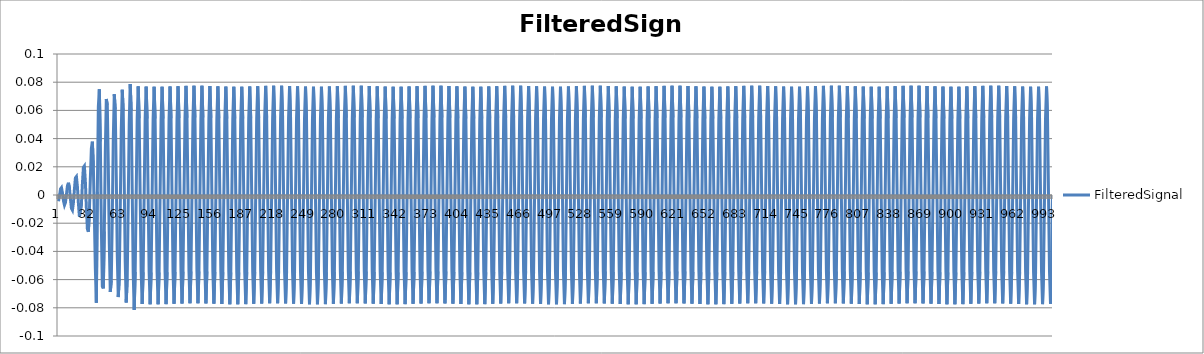
| Category | FilteredSignal |
|---|---|
| 0 | -0.004 |
| 1 | -0.001 |
| 2 | 0.004 |
| 3 | 0.005 |
| 4 | 0.001 |
| 5 | -0.004 |
| 6 | -0.007 |
| 7 | -0.005 |
| 8 | 0.001 |
| 9 | 0.007 |
| 10 | 0.009 |
| 11 | 0.005 |
| 12 | -0.003 |
| 13 | -0.01 |
| 14 | -0.011 |
| 15 | -0.005 |
| 16 | 0.004 |
| 17 | 0.012 |
| 18 | 0.013 |
| 19 | 0.006 |
| 20 | -0.006 |
| 21 | -0.015 |
| 22 | -0.016 |
| 23 | -0.007 |
| 24 | 0.008 |
| 25 | 0.02 |
| 26 | 0.021 |
| 27 | 0.009 |
| 28 | -0.009 |
| 29 | -0.024 |
| 30 | -0.026 |
| 31 | -0.012 |
| 32 | 0.012 |
| 33 | 0.033 |
| 34 | 0.038 |
| 35 | 0.02 |
| 36 | -0.014 |
| 37 | -0.052 |
| 38 | -0.076 |
| 39 | 0.002 |
| 40 | 0.063 |
| 41 | 0.075 |
| 42 | 0.038 |
| 43 | -0.021 |
| 44 | -0.065 |
| 45 | -0.066 |
| 46 | -0.026 |
| 47 | 0.031 |
| 48 | 0.068 |
| 49 | 0.064 |
| 50 | 0.021 |
| 51 | -0.035 |
| 52 | -0.069 |
| 53 | -0.061 |
| 54 | -0.016 |
| 55 | 0.04 |
| 56 | 0.071 |
| 57 | 0.061 |
| 58 | 0.013 |
| 59 | -0.042 |
| 60 | -0.072 |
| 61 | -0.059 |
| 62 | -0.01 |
| 63 | 0.045 |
| 64 | 0.075 |
| 65 | 0.06 |
| 66 | 0.009 |
| 67 | -0.048 |
| 68 | -0.076 |
| 69 | -0.06 |
| 70 | -0.007 |
| 71 | 0.051 |
| 72 | 0.079 |
| 73 | 0.06 |
| 74 | 0.004 |
| 75 | -0.055 |
| 76 | -0.081 |
| 77 | -0.055 |
| 78 | 0 |
| 79 | 0.055 |
| 80 | 0.077 |
| 81 | 0.054 |
| 82 | 0 |
| 83 | -0.055 |
| 84 | -0.077 |
| 85 | -0.055 |
| 86 | 0 |
| 87 | 0.054 |
| 88 | 0.077 |
| 89 | 0.054 |
| 90 | 0 |
| 91 | -0.055 |
| 92 | -0.077 |
| 93 | -0.055 |
| 94 | 0 |
| 95 | 0.054 |
| 96 | 0.077 |
| 97 | 0.054 |
| 98 | 0 |
| 99 | -0.055 |
| 100 | -0.077 |
| 101 | -0.055 |
| 102 | 0 |
| 103 | 0.054 |
| 104 | 0.077 |
| 105 | 0.054 |
| 106 | 0 |
| 107 | -0.055 |
| 108 | -0.077 |
| 109 | -0.055 |
| 110 | 0 |
| 111 | 0.054 |
| 112 | 0.077 |
| 113 | 0.054 |
| 114 | 0 |
| 115 | -0.055 |
| 116 | -0.077 |
| 117 | -0.055 |
| 118 | 0 |
| 119 | 0.055 |
| 120 | 0.077 |
| 121 | 0.055 |
| 122 | 0 |
| 123 | -0.054 |
| 124 | -0.077 |
| 125 | -0.054 |
| 126 | 0 |
| 127 | 0.055 |
| 128 | 0.077 |
| 129 | 0.055 |
| 130 | 0 |
| 131 | -0.054 |
| 132 | -0.077 |
| 133 | -0.054 |
| 134 | 0 |
| 135 | 0.055 |
| 136 | 0.077 |
| 137 | 0.055 |
| 138 | 0 |
| 139 | -0.054 |
| 140 | -0.077 |
| 141 | -0.054 |
| 142 | 0 |
| 143 | 0.055 |
| 144 | 0.077 |
| 145 | 0.055 |
| 146 | 0 |
| 147 | -0.054 |
| 148 | -0.077 |
| 149 | -0.054 |
| 150 | 0 |
| 151 | 0.055 |
| 152 | 0.077 |
| 153 | 0.055 |
| 154 | 0 |
| 155 | -0.054 |
| 156 | -0.077 |
| 157 | -0.055 |
| 158 | 0 |
| 159 | 0.055 |
| 160 | 0.077 |
| 161 | 0.054 |
| 162 | 0 |
| 163 | -0.055 |
| 164 | -0.077 |
| 165 | -0.055 |
| 166 | 0 |
| 167 | 0.054 |
| 168 | 0.077 |
| 169 | 0.054 |
| 170 | 0 |
| 171 | -0.055 |
| 172 | -0.077 |
| 173 | -0.055 |
| 174 | 0 |
| 175 | 0.054 |
| 176 | 0.077 |
| 177 | 0.054 |
| 178 | 0 |
| 179 | -0.055 |
| 180 | -0.077 |
| 181 | -0.055 |
| 182 | 0 |
| 183 | 0.054 |
| 184 | 0.077 |
| 185 | 0.054 |
| 186 | 0 |
| 187 | -0.055 |
| 188 | -0.077 |
| 189 | -0.055 |
| 190 | 0 |
| 191 | 0.054 |
| 192 | 0.077 |
| 193 | 0.054 |
| 194 | 0 |
| 195 | -0.055 |
| 196 | -0.077 |
| 197 | -0.055 |
| 198 | 0 |
| 199 | 0.055 |
| 200 | 0.077 |
| 201 | 0.055 |
| 202 | 0 |
| 203 | -0.054 |
| 204 | -0.077 |
| 205 | -0.054 |
| 206 | 0 |
| 207 | 0.055 |
| 208 | 0.077 |
| 209 | 0.055 |
| 210 | 0 |
| 211 | -0.054 |
| 212 | -0.077 |
| 213 | -0.054 |
| 214 | 0 |
| 215 | 0.055 |
| 216 | 0.077 |
| 217 | 0.055 |
| 218 | 0 |
| 219 | -0.054 |
| 220 | -0.077 |
| 221 | -0.054 |
| 222 | 0 |
| 223 | 0.055 |
| 224 | 0.077 |
| 225 | 0.055 |
| 226 | 0 |
| 227 | -0.054 |
| 228 | -0.077 |
| 229 | -0.054 |
| 230 | 0 |
| 231 | 0.055 |
| 232 | 0.077 |
| 233 | 0.055 |
| 234 | 0 |
| 235 | -0.054 |
| 236 | -0.077 |
| 237 | -0.055 |
| 238 | 0 |
| 239 | 0.055 |
| 240 | 0.077 |
| 241 | 0.054 |
| 242 | 0 |
| 243 | -0.055 |
| 244 | -0.077 |
| 245 | -0.055 |
| 246 | 0 |
| 247 | 0.054 |
| 248 | 0.077 |
| 249 | 0.054 |
| 250 | 0 |
| 251 | -0.055 |
| 252 | -0.077 |
| 253 | -0.055 |
| 254 | 0 |
| 255 | 0.054 |
| 256 | 0.077 |
| 257 | 0.054 |
| 258 | 0 |
| 259 | -0.055 |
| 260 | -0.077 |
| 261 | -0.055 |
| 262 | 0 |
| 263 | 0.054 |
| 264 | 0.077 |
| 265 | 0.054 |
| 266 | 0 |
| 267 | -0.055 |
| 268 | -0.077 |
| 269 | -0.055 |
| 270 | 0 |
| 271 | 0.054 |
| 272 | 0.077 |
| 273 | 0.054 |
| 274 | 0 |
| 275 | -0.055 |
| 276 | -0.077 |
| 277 | -0.055 |
| 278 | 0 |
| 279 | 0.055 |
| 280 | 0.077 |
| 281 | 0.055 |
| 282 | 0 |
| 283 | -0.054 |
| 284 | -0.077 |
| 285 | -0.054 |
| 286 | 0 |
| 287 | 0.055 |
| 288 | 0.077 |
| 289 | 0.055 |
| 290 | 0 |
| 291 | -0.054 |
| 292 | -0.077 |
| 293 | -0.054 |
| 294 | 0 |
| 295 | 0.055 |
| 296 | 0.077 |
| 297 | 0.055 |
| 298 | 0 |
| 299 | -0.054 |
| 300 | -0.077 |
| 301 | -0.054 |
| 302 | 0 |
| 303 | 0.055 |
| 304 | 0.077 |
| 305 | 0.055 |
| 306 | 0 |
| 307 | -0.054 |
| 308 | -0.077 |
| 309 | -0.054 |
| 310 | 0 |
| 311 | 0.055 |
| 312 | 0.077 |
| 313 | 0.055 |
| 314 | 0 |
| 315 | -0.054 |
| 316 | -0.077 |
| 317 | -0.055 |
| 318 | 0 |
| 319 | 0.055 |
| 320 | 0.077 |
| 321 | 0.054 |
| 322 | 0 |
| 323 | -0.055 |
| 324 | -0.077 |
| 325 | -0.055 |
| 326 | 0 |
| 327 | 0.054 |
| 328 | 0.077 |
| 329 | 0.054 |
| 330 | 0 |
| 331 | -0.055 |
| 332 | -0.077 |
| 333 | -0.055 |
| 334 | 0 |
| 335 | 0.054 |
| 336 | 0.077 |
| 337 | 0.054 |
| 338 | 0 |
| 339 | -0.055 |
| 340 | -0.077 |
| 341 | -0.055 |
| 342 | 0 |
| 343 | 0.054 |
| 344 | 0.077 |
| 345 | 0.054 |
| 346 | 0 |
| 347 | -0.055 |
| 348 | -0.077 |
| 349 | -0.055 |
| 350 | 0 |
| 351 | 0.054 |
| 352 | 0.077 |
| 353 | 0.054 |
| 354 | 0 |
| 355 | -0.055 |
| 356 | -0.077 |
| 357 | -0.055 |
| 358 | 0 |
| 359 | 0.055 |
| 360 | 0.077 |
| 361 | 0.055 |
| 362 | 0 |
| 363 | -0.054 |
| 364 | -0.077 |
| 365 | -0.054 |
| 366 | 0 |
| 367 | 0.055 |
| 368 | 0.077 |
| 369 | 0.055 |
| 370 | 0 |
| 371 | -0.054 |
| 372 | -0.077 |
| 373 | -0.054 |
| 374 | 0 |
| 375 | 0.055 |
| 376 | 0.077 |
| 377 | 0.055 |
| 378 | 0 |
| 379 | -0.054 |
| 380 | -0.077 |
| 381 | -0.054 |
| 382 | 0 |
| 383 | 0.055 |
| 384 | 0.077 |
| 385 | 0.055 |
| 386 | 0 |
| 387 | -0.054 |
| 388 | -0.077 |
| 389 | -0.054 |
| 390 | 0 |
| 391 | 0.055 |
| 392 | 0.077 |
| 393 | 0.055 |
| 394 | 0 |
| 395 | -0.054 |
| 396 | -0.077 |
| 397 | -0.055 |
| 398 | 0 |
| 399 | 0.055 |
| 400 | 0.077 |
| 401 | 0.054 |
| 402 | 0 |
| 403 | -0.055 |
| 404 | -0.077 |
| 405 | -0.055 |
| 406 | 0 |
| 407 | 0.054 |
| 408 | 0.077 |
| 409 | 0.054 |
| 410 | 0 |
| 411 | -0.055 |
| 412 | -0.077 |
| 413 | -0.055 |
| 414 | 0 |
| 415 | 0.054 |
| 416 | 0.077 |
| 417 | 0.054 |
| 418 | 0 |
| 419 | -0.055 |
| 420 | -0.077 |
| 421 | -0.055 |
| 422 | 0 |
| 423 | 0.054 |
| 424 | 0.077 |
| 425 | 0.054 |
| 426 | 0 |
| 427 | -0.055 |
| 428 | -0.077 |
| 429 | -0.055 |
| 430 | 0 |
| 431 | 0.054 |
| 432 | 0.077 |
| 433 | 0.054 |
| 434 | 0 |
| 435 | -0.055 |
| 436 | -0.077 |
| 437 | -0.055 |
| 438 | 0 |
| 439 | 0.055 |
| 440 | 0.077 |
| 441 | 0.055 |
| 442 | 0 |
| 443 | -0.054 |
| 444 | -0.077 |
| 445 | -0.054 |
| 446 | 0 |
| 447 | 0.055 |
| 448 | 0.077 |
| 449 | 0.055 |
| 450 | 0 |
| 451 | -0.054 |
| 452 | -0.077 |
| 453 | -0.054 |
| 454 | 0 |
| 455 | 0.055 |
| 456 | 0.077 |
| 457 | 0.055 |
| 458 | 0 |
| 459 | -0.054 |
| 460 | -0.077 |
| 461 | -0.054 |
| 462 | 0 |
| 463 | 0.055 |
| 464 | 0.077 |
| 465 | 0.055 |
| 466 | 0 |
| 467 | -0.054 |
| 468 | -0.077 |
| 469 | -0.054 |
| 470 | 0 |
| 471 | 0.055 |
| 472 | 0.077 |
| 473 | 0.055 |
| 474 | 0 |
| 475 | -0.054 |
| 476 | -0.077 |
| 477 | -0.055 |
| 478 | 0 |
| 479 | 0.055 |
| 480 | 0.077 |
| 481 | 0.054 |
| 482 | 0 |
| 483 | -0.055 |
| 484 | -0.077 |
| 485 | -0.055 |
| 486 | 0 |
| 487 | 0.054 |
| 488 | 0.077 |
| 489 | 0.054 |
| 490 | 0 |
| 491 | -0.055 |
| 492 | -0.077 |
| 493 | -0.055 |
| 494 | 0 |
| 495 | 0.054 |
| 496 | 0.077 |
| 497 | 0.054 |
| 498 | 0 |
| 499 | -0.055 |
| 500 | -0.077 |
| 501 | -0.055 |
| 502 | 0 |
| 503 | 0.054 |
| 504 | 0.077 |
| 505 | 0.054 |
| 506 | 0 |
| 507 | -0.055 |
| 508 | -0.077 |
| 509 | -0.055 |
| 510 | 0 |
| 511 | 0.054 |
| 512 | 0.077 |
| 513 | 0.054 |
| 514 | 0 |
| 515 | -0.055 |
| 516 | -0.077 |
| 517 | -0.055 |
| 518 | 0 |
| 519 | 0.055 |
| 520 | 0.077 |
| 521 | 0.055 |
| 522 | 0 |
| 523 | -0.054 |
| 524 | -0.077 |
| 525 | -0.054 |
| 526 | 0 |
| 527 | 0.055 |
| 528 | 0.077 |
| 529 | 0.055 |
| 530 | 0 |
| 531 | -0.054 |
| 532 | -0.077 |
| 533 | -0.054 |
| 534 | 0 |
| 535 | 0.055 |
| 536 | 0.077 |
| 537 | 0.055 |
| 538 | 0 |
| 539 | -0.054 |
| 540 | -0.077 |
| 541 | -0.054 |
| 542 | 0 |
| 543 | 0.055 |
| 544 | 0.077 |
| 545 | 0.055 |
| 546 | 0 |
| 547 | -0.054 |
| 548 | -0.077 |
| 549 | -0.054 |
| 550 | 0 |
| 551 | 0.055 |
| 552 | 0.077 |
| 553 | 0.055 |
| 554 | 0 |
| 555 | -0.054 |
| 556 | -0.077 |
| 557 | -0.055 |
| 558 | 0 |
| 559 | 0.055 |
| 560 | 0.077 |
| 561 | 0.054 |
| 562 | 0 |
| 563 | -0.055 |
| 564 | -0.077 |
| 565 | -0.055 |
| 566 | 0 |
| 567 | 0.054 |
| 568 | 0.077 |
| 569 | 0.054 |
| 570 | 0 |
| 571 | -0.055 |
| 572 | -0.077 |
| 573 | -0.055 |
| 574 | 0 |
| 575 | 0.054 |
| 576 | 0.077 |
| 577 | 0.054 |
| 578 | 0 |
| 579 | -0.055 |
| 580 | -0.077 |
| 581 | -0.055 |
| 582 | 0 |
| 583 | 0.054 |
| 584 | 0.077 |
| 585 | 0.054 |
| 586 | 0 |
| 587 | -0.055 |
| 588 | -0.077 |
| 589 | -0.055 |
| 590 | 0 |
| 591 | 0.054 |
| 592 | 0.077 |
| 593 | 0.054 |
| 594 | 0 |
| 595 | -0.055 |
| 596 | -0.077 |
| 597 | -0.055 |
| 598 | 0 |
| 599 | 0.055 |
| 600 | 0.077 |
| 601 | 0.055 |
| 602 | 0 |
| 603 | -0.054 |
| 604 | -0.077 |
| 605 | -0.054 |
| 606 | 0 |
| 607 | 0.055 |
| 608 | 0.077 |
| 609 | 0.055 |
| 610 | 0 |
| 611 | -0.054 |
| 612 | -0.077 |
| 613 | -0.054 |
| 614 | 0 |
| 615 | 0.055 |
| 616 | 0.077 |
| 617 | 0.055 |
| 618 | 0 |
| 619 | -0.054 |
| 620 | -0.077 |
| 621 | -0.054 |
| 622 | 0 |
| 623 | 0.055 |
| 624 | 0.077 |
| 625 | 0.055 |
| 626 | 0 |
| 627 | -0.054 |
| 628 | -0.077 |
| 629 | -0.054 |
| 630 | 0 |
| 631 | 0.055 |
| 632 | 0.077 |
| 633 | 0.055 |
| 634 | 0 |
| 635 | -0.054 |
| 636 | -0.077 |
| 637 | -0.055 |
| 638 | 0 |
| 639 | 0.055 |
| 640 | 0.077 |
| 641 | 0.054 |
| 642 | 0 |
| 643 | -0.055 |
| 644 | -0.077 |
| 645 | -0.055 |
| 646 | 0 |
| 647 | 0.054 |
| 648 | 0.077 |
| 649 | 0.054 |
| 650 | 0 |
| 651 | -0.055 |
| 652 | -0.077 |
| 653 | -0.055 |
| 654 | 0 |
| 655 | 0.054 |
| 656 | 0.077 |
| 657 | 0.054 |
| 658 | 0 |
| 659 | -0.055 |
| 660 | -0.077 |
| 661 | -0.055 |
| 662 | 0 |
| 663 | 0.054 |
| 664 | 0.077 |
| 665 | 0.054 |
| 666 | 0 |
| 667 | -0.055 |
| 668 | -0.077 |
| 669 | -0.055 |
| 670 | 0 |
| 671 | 0.054 |
| 672 | 0.077 |
| 673 | 0.054 |
| 674 | 0 |
| 675 | -0.055 |
| 676 | -0.077 |
| 677 | -0.055 |
| 678 | 0 |
| 679 | 0.055 |
| 680 | 0.077 |
| 681 | 0.055 |
| 682 | 0 |
| 683 | -0.054 |
| 684 | -0.077 |
| 685 | -0.054 |
| 686 | 0 |
| 687 | 0.055 |
| 688 | 0.077 |
| 689 | 0.055 |
| 690 | 0 |
| 691 | -0.054 |
| 692 | -0.077 |
| 693 | -0.054 |
| 694 | 0 |
| 695 | 0.055 |
| 696 | 0.077 |
| 697 | 0.055 |
| 698 | 0 |
| 699 | -0.054 |
| 700 | -0.077 |
| 701 | -0.054 |
| 702 | 0 |
| 703 | 0.055 |
| 704 | 0.077 |
| 705 | 0.055 |
| 706 | 0 |
| 707 | -0.054 |
| 708 | -0.077 |
| 709 | -0.054 |
| 710 | 0 |
| 711 | 0.055 |
| 712 | 0.077 |
| 713 | 0.055 |
| 714 | 0 |
| 715 | -0.054 |
| 716 | -0.077 |
| 717 | -0.055 |
| 718 | 0 |
| 719 | 0.055 |
| 720 | 0.077 |
| 721 | 0.054 |
| 722 | 0 |
| 723 | -0.055 |
| 724 | -0.077 |
| 725 | -0.055 |
| 726 | 0 |
| 727 | 0.054 |
| 728 | 0.077 |
| 729 | 0.054 |
| 730 | 0 |
| 731 | -0.055 |
| 732 | -0.077 |
| 733 | -0.055 |
| 734 | 0 |
| 735 | 0.054 |
| 736 | 0.077 |
| 737 | 0.054 |
| 738 | 0 |
| 739 | -0.055 |
| 740 | -0.077 |
| 741 | -0.055 |
| 742 | 0 |
| 743 | 0.054 |
| 744 | 0.077 |
| 745 | 0.054 |
| 746 | 0 |
| 747 | -0.055 |
| 748 | -0.077 |
| 749 | -0.055 |
| 750 | 0 |
| 751 | 0.054 |
| 752 | 0.077 |
| 753 | 0.054 |
| 754 | 0 |
| 755 | -0.055 |
| 756 | -0.077 |
| 757 | -0.055 |
| 758 | 0 |
| 759 | 0.055 |
| 760 | 0.077 |
| 761 | 0.055 |
| 762 | 0 |
| 763 | -0.054 |
| 764 | -0.077 |
| 765 | -0.054 |
| 766 | 0 |
| 767 | 0.055 |
| 768 | 0.077 |
| 769 | 0.055 |
| 770 | 0 |
| 771 | -0.054 |
| 772 | -0.077 |
| 773 | -0.054 |
| 774 | 0 |
| 775 | 0.055 |
| 776 | 0.077 |
| 777 | 0.055 |
| 778 | 0 |
| 779 | -0.054 |
| 780 | -0.077 |
| 781 | -0.054 |
| 782 | 0 |
| 783 | 0.055 |
| 784 | 0.077 |
| 785 | 0.055 |
| 786 | 0 |
| 787 | -0.054 |
| 788 | -0.077 |
| 789 | -0.054 |
| 790 | 0 |
| 791 | 0.055 |
| 792 | 0.077 |
| 793 | 0.055 |
| 794 | 0 |
| 795 | -0.054 |
| 796 | -0.077 |
| 797 | -0.055 |
| 798 | 0 |
| 799 | 0.055 |
| 800 | 0.077 |
| 801 | 0.054 |
| 802 | 0 |
| 803 | -0.055 |
| 804 | -0.077 |
| 805 | -0.055 |
| 806 | 0 |
| 807 | 0.054 |
| 808 | 0.077 |
| 809 | 0.054 |
| 810 | 0 |
| 811 | -0.055 |
| 812 | -0.077 |
| 813 | -0.055 |
| 814 | 0 |
| 815 | 0.054 |
| 816 | 0.077 |
| 817 | 0.054 |
| 818 | 0 |
| 819 | -0.055 |
| 820 | -0.077 |
| 821 | -0.055 |
| 822 | 0 |
| 823 | 0.054 |
| 824 | 0.077 |
| 825 | 0.054 |
| 826 | 0 |
| 827 | -0.055 |
| 828 | -0.077 |
| 829 | -0.055 |
| 830 | 0 |
| 831 | 0.054 |
| 832 | 0.077 |
| 833 | 0.054 |
| 834 | 0 |
| 835 | -0.055 |
| 836 | -0.077 |
| 837 | -0.055 |
| 838 | 0 |
| 839 | 0.055 |
| 840 | 0.077 |
| 841 | 0.055 |
| 842 | 0 |
| 843 | -0.054 |
| 844 | -0.077 |
| 845 | -0.054 |
| 846 | 0 |
| 847 | 0.055 |
| 848 | 0.077 |
| 849 | 0.055 |
| 850 | 0 |
| 851 | -0.054 |
| 852 | -0.077 |
| 853 | -0.054 |
| 854 | 0 |
| 855 | 0.055 |
| 856 | 0.077 |
| 857 | 0.055 |
| 858 | 0 |
| 859 | -0.054 |
| 860 | -0.077 |
| 861 | -0.054 |
| 862 | 0 |
| 863 | 0.055 |
| 864 | 0.077 |
| 865 | 0.055 |
| 866 | 0 |
| 867 | -0.054 |
| 868 | -0.077 |
| 869 | -0.054 |
| 870 | 0 |
| 871 | 0.055 |
| 872 | 0.077 |
| 873 | 0.055 |
| 874 | 0 |
| 875 | -0.054 |
| 876 | -0.077 |
| 877 | -0.055 |
| 878 | 0 |
| 879 | 0.055 |
| 880 | 0.077 |
| 881 | 0.054 |
| 882 | 0 |
| 883 | -0.055 |
| 884 | -0.077 |
| 885 | -0.055 |
| 886 | 0 |
| 887 | 0.054 |
| 888 | 0.077 |
| 889 | 0.054 |
| 890 | 0 |
| 891 | -0.055 |
| 892 | -0.077 |
| 893 | -0.055 |
| 894 | 0 |
| 895 | 0.054 |
| 896 | 0.077 |
| 897 | 0.054 |
| 898 | 0 |
| 899 | -0.055 |
| 900 | -0.077 |
| 901 | -0.055 |
| 902 | 0 |
| 903 | 0.054 |
| 904 | 0.077 |
| 905 | 0.054 |
| 906 | 0 |
| 907 | -0.055 |
| 908 | -0.077 |
| 909 | -0.055 |
| 910 | 0 |
| 911 | 0.054 |
| 912 | 0.077 |
| 913 | 0.054 |
| 914 | 0 |
| 915 | -0.055 |
| 916 | -0.077 |
| 917 | -0.055 |
| 918 | 0 |
| 919 | 0.055 |
| 920 | 0.077 |
| 921 | 0.055 |
| 922 | 0 |
| 923 | -0.054 |
| 924 | -0.077 |
| 925 | -0.054 |
| 926 | 0 |
| 927 | 0.055 |
| 928 | 0.077 |
| 929 | 0.055 |
| 930 | 0 |
| 931 | -0.054 |
| 932 | -0.077 |
| 933 | -0.054 |
| 934 | 0 |
| 935 | 0.055 |
| 936 | 0.077 |
| 937 | 0.055 |
| 938 | 0 |
| 939 | -0.054 |
| 940 | -0.077 |
| 941 | -0.054 |
| 942 | 0 |
| 943 | 0.055 |
| 944 | 0.077 |
| 945 | 0.055 |
| 946 | 0 |
| 947 | -0.054 |
| 948 | -0.077 |
| 949 | -0.054 |
| 950 | 0 |
| 951 | 0.055 |
| 952 | 0.077 |
| 953 | 0.055 |
| 954 | 0 |
| 955 | -0.054 |
| 956 | -0.077 |
| 957 | -0.055 |
| 958 | 0 |
| 959 | 0.055 |
| 960 | 0.077 |
| 961 | 0.054 |
| 962 | 0 |
| 963 | -0.055 |
| 964 | -0.077 |
| 965 | -0.055 |
| 966 | 0 |
| 967 | 0.054 |
| 968 | 0.077 |
| 969 | 0.054 |
| 970 | 0 |
| 971 | -0.055 |
| 972 | -0.077 |
| 973 | -0.055 |
| 974 | 0 |
| 975 | 0.054 |
| 976 | 0.077 |
| 977 | 0.054 |
| 978 | 0 |
| 979 | -0.055 |
| 980 | -0.077 |
| 981 | -0.055 |
| 982 | 0 |
| 983 | 0.054 |
| 984 | 0.077 |
| 985 | 0.054 |
| 986 | 0 |
| 987 | -0.055 |
| 988 | -0.077 |
| 989 | -0.055 |
| 990 | 0 |
| 991 | 0.054 |
| 992 | 0.077 |
| 993 | 0.054 |
| 994 | 0 |
| 995 | -0.055 |
| 996 | -0.077 |
| 997 | -0.055 |
| 998 | 0 |